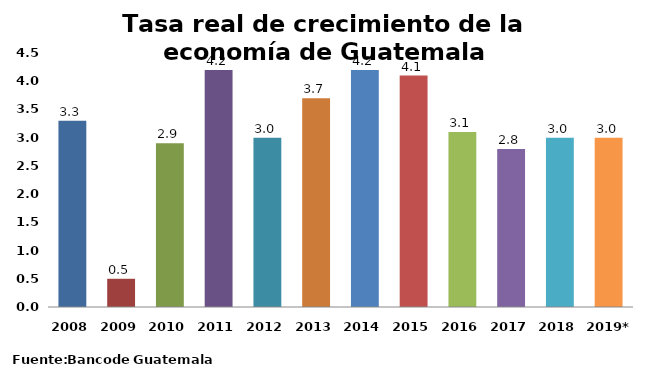
| Category | Series 0 |
|---|---|
| 2008 | 3.3 |
| 2009 | 0.5 |
| 2010 | 2.9 |
| 2011 | 4.2 |
| 2012 | 3 |
| 2013 | 3.7 |
| 2014 | 4.2 |
| 2015 | 4.1 |
| 2016 | 3.1 |
| 2017 | 2.8 |
| 2018 | 3 |
| 2019* | 3 |